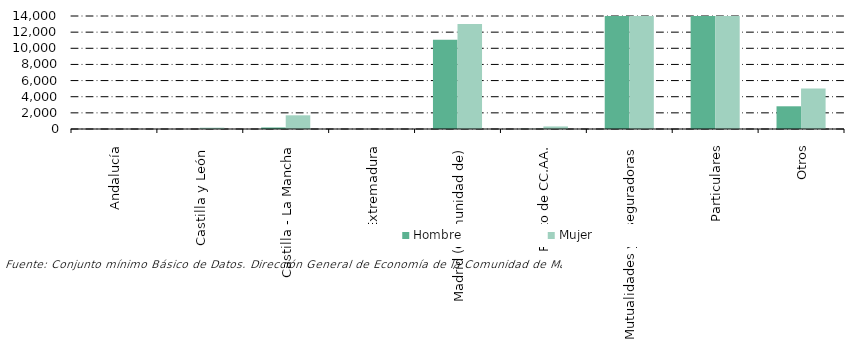
| Category | Hombre | Mujer |
|---|---|---|
| Andalucía | 1 | 0 |
| Castilla y León  | 2 | 165 |
| Castilla - La Mancha | 190 | 1697 |
| Extremadura | 0 | 0 |
| Madrid (Comunidad de) | 11048 | 13000 |
| Resto de CC.AA. | 15 | 318 |
| Mutualidades y aseguradoras | 102198 | 123753 |
| Particulares | 14851 | 24289 |
| Otros | 2814 | 5015 |